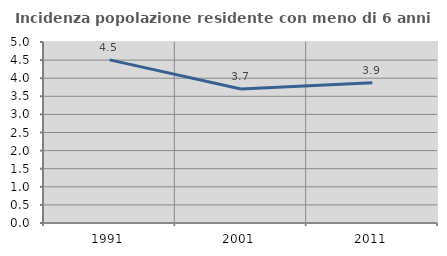
| Category | Incidenza popolazione residente con meno di 6 anni |
|---|---|
| 1991.0 | 4.506 |
| 2001.0 | 3.7 |
| 2011.0 | 3.875 |